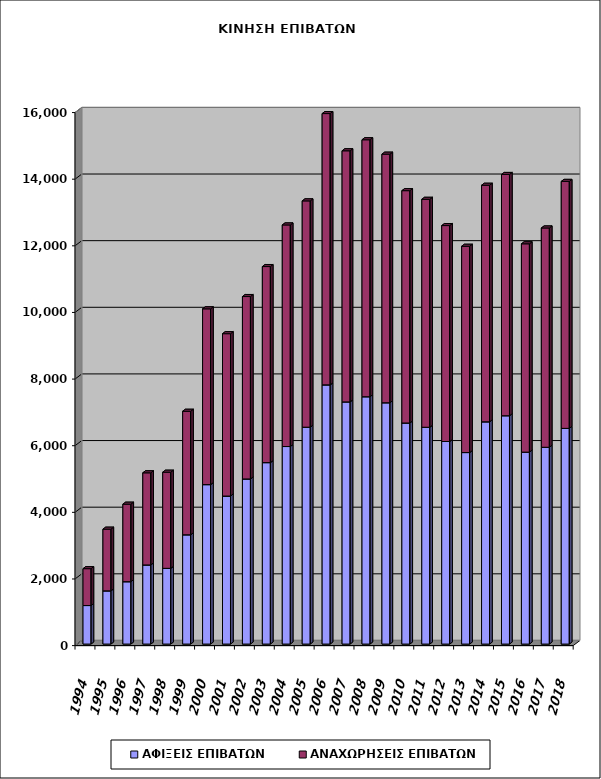
| Category | ΑΦΙΞΕΙΣ ΕΠΙΒΑΤΩΝ | ΑΝΑΧΩΡΗΣΕΙΣ ΕΠΙΒΑΤΩΝ |
|---|---|---|
| 1994.0 | 1156 | 1107 |
| 1995.0 | 1597 | 1851 |
| 1996.0 | 1872 | 2326 |
| 1997.0 | 2375 | 2765 |
| 1998.0 | 2273 | 2885 |
| 1999.0 | 3280 | 3707 |
| 2000.0 | 4786 | 5276 |
| 2001.0 | 4443 | 4873 |
| 2002.0 | 4956 | 5475 |
| 2003.0 | 5446 | 5885 |
| 2004.0 | 5929 | 6651 |
| 2005.0 | 6510 | 6792 |
| 2006.0 | 7780 | 8143 |
| 2007.0 | 7269 | 7537 |
| 2008.0 | 7424 | 7713 |
| 2009.0 | 7243 | 7461 |
| 2010.0 | 6636 | 6973 |
| 2011.0 | 6508 | 6841 |
| 2012.0 | 6080 | 6481 |
| 2013.0 | 5748 | 6192 |
| 2014.0 | 6671 | 7100 |
| 2015.0 | 6854 | 7241 |
| 2016.0 | 5761 | 6253 |
| 2017.0 | 5907 | 6582 |
| 2018.0 | 6474 | 7413 |